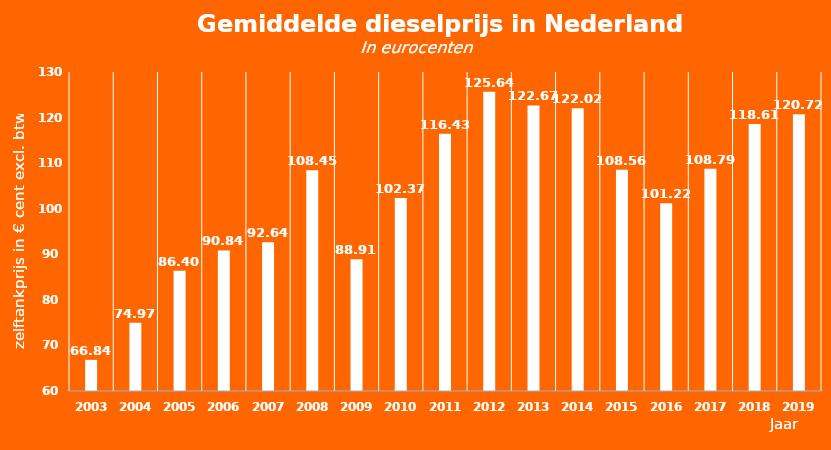
| Category | 2003 |
|---|---|
| 2003.0 | 66.835 |
| 2004.0 | 74.968 |
| 2005.0 | 86.396 |
| 2006.0 | 90.837 |
| 2007.0 | 92.645 |
| 2008.0 | 108.446 |
| 2009.0 | 88.912 |
| 2010.0 | 102.373 |
| 2011.0 | 116.434 |
| 2012.0 | 125.64 |
| 2013.0 | 122.67 |
| 2014.0 | 122.019 |
| 2015.0 | 108.56 |
| 2016.0 | 101.22 |
| 2017.0 | 108.79 |
| 2018.0 | 118.61 |
| 2019.0 | 120.72 |